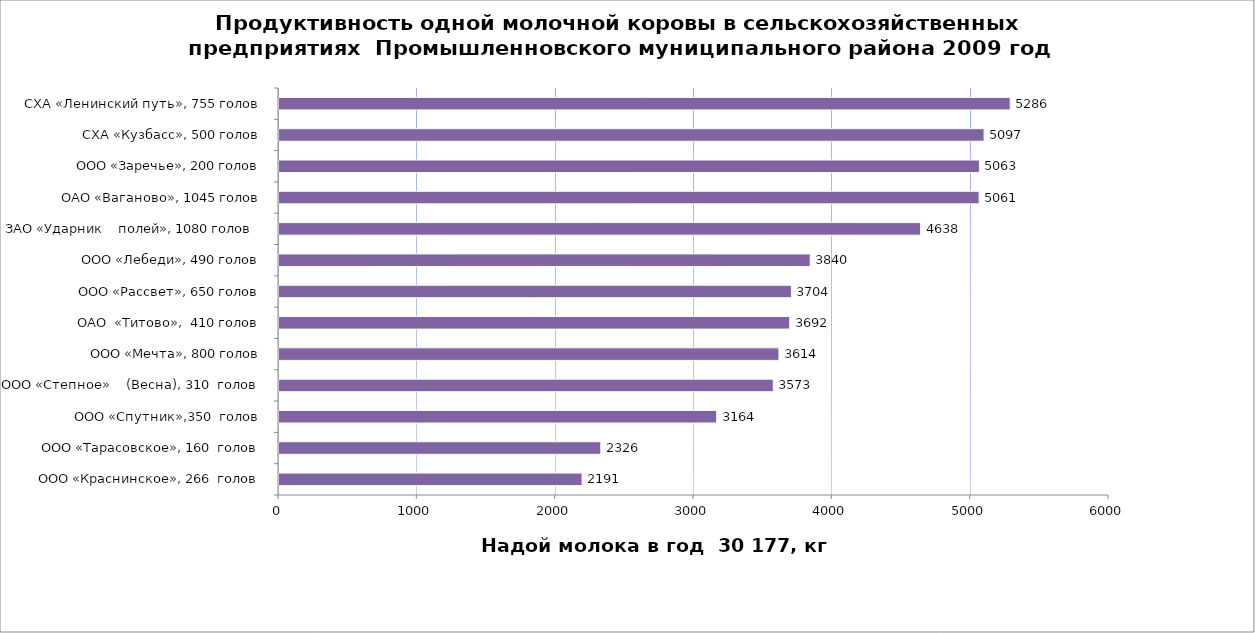
| Category | Series 0 |
|---|---|
| ООО «Краснинское», 266  голов | 2191 |
| ООО «Тарасовское», 160  голов | 2326 |
| ООО «Спутник»,350  голов | 3164 |
| ООО «Степное»    (Весна), 310  голов | 3573 |
| ООО «Мечта», 800 голов | 3614 |
| ОАО  «Титово»,  410 голов | 3692 |
| ООО «Рассвет», 650 голов | 3704 |
| ООО «Лебеди», 490 голов | 3840 |
| ЗАО «Ударник    полей», 1080 голов  | 4638 |
| ОАО «Ваганово», 1045 голов | 5061 |
| ООО «Заречье», 200 голов | 5063 |
| СХА «Кузбасс», 500 голов | 5097 |
| СХА «Ленинский путь», 755 голов | 5286 |